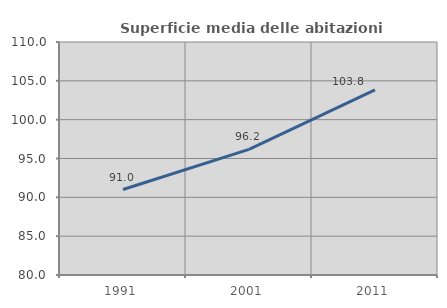
| Category | Superficie media delle abitazioni occupate |
|---|---|
| 1991.0 | 91.008 |
| 2001.0 | 96.183 |
| 2011.0 | 103.848 |